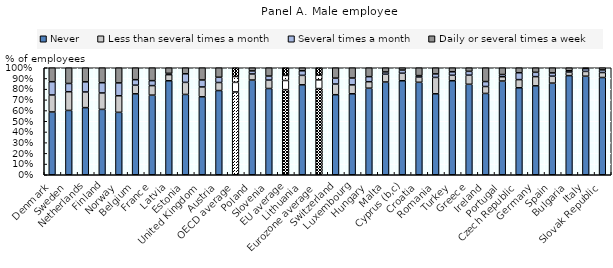
| Category | Never | Less than several times a month | Several times a month | Daily or several times a week |
|---|---|---|---|---|
| Denmark | 0.587 | 0.159 | 0.124 | 0.13 |
| Sweden | 0.601 | 0.175 | 0.077 | 0.147 |
| Netherlands | 0.627 | 0.146 | 0.095 | 0.132 |
| Finland | 0.611 | 0.153 | 0.096 | 0.14 |
| Norway | 0.583 | 0.155 | 0.12 | 0.141 |
| Belgium | 0.756 | 0.081 | 0.051 | 0.111 |
| France | 0.744 | 0.089 | 0.046 | 0.12 |
| Latvia | 0.878 | 0.057 | 0.012 | 0.052 |
| Estonia | 0.751 | 0.113 | 0.08 | 0.056 |
| United Kingdom | 0.728 | 0.092 | 0.065 | 0.114 |
| Austria | 0.787 | 0.075 | 0.049 | 0.089 |
| OECD average | 0.774 | 0.089 | 0.055 | 0.082 |
| Poland | 0.885 | 0.057 | 0.029 | 0.029 |
| Slovenia | 0.806 | 0.079 | 0.037 | 0.078 |
| EU average | 0.795 | 0.086 | 0.047 | 0.072 |
| Lithuania | 0.841 | 0.088 | 0.043 | 0.028 |
| Eurozone average | 0.805 | 0.081 | 0.045 | 0.069 |
| Switzerland | 0.748 | 0.1 | 0.055 | 0.097 |
| Luxembourg | 0.757 | 0.083 | 0.064 | 0.096 |
| Hungary | 0.809 | 0.061 | 0.047 | 0.083 |
| Malta | 0.867 | 0.073 | 0.021 | 0.039 |
| Cyprus (b,c) | 0.879 | 0.07 | 0.03 | 0.022 |
| Croatia | 0.864 | 0.049 | 0.013 | 0.073 |
| Romania | 0.757 | 0.153 | 0.033 | 0.057 |
| Turkey | 0.879 | 0.051 | 0.033 | 0.038 |
| Greece | 0.846 | 0.085 | 0.036 | 0.033 |
| Ireland | 0.76 | 0.065 | 0.046 | 0.129 |
| Portugal | 0.876 | 0.04 | 0.021 | 0.063 |
| Czech Republic | 0.813 | 0.076 | 0.064 | 0.047 |
| Germany | 0.831 | 0.086 | 0.04 | 0.043 |
| Spain | 0.856 | 0.065 | 0.03 | 0.048 |
| Bulgaria | 0.927 | 0.033 | 0.012 | 0.028 |
| Italy | 0.921 | 0.045 | 0.026 | 0.009 |
| Slovak Republic | 0.909 | 0.046 | 0.025 | 0.02 |